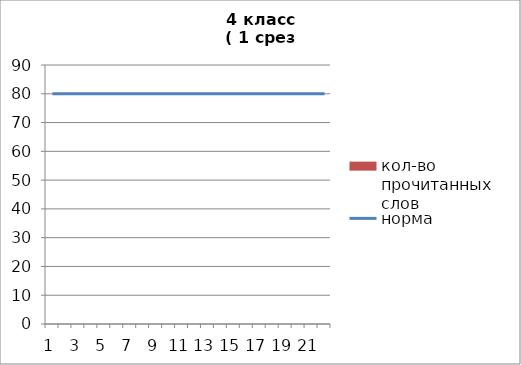
| Category | кол-во прочитанных слов |
|---|---|
| 0 | 0 |
| 1 | 0 |
| 2 | 0 |
| 3 | 0 |
| 4 | 0 |
| 5 | 0 |
| 6 | 0 |
| 7 | 0 |
| 8 | 0 |
| 9 | 0 |
| 10 | 0 |
| 11 | 0 |
| 12 | 0 |
| 13 | 0 |
| 14 | 0 |
| 15 | 0 |
| 16 | 0 |
| 17 | 0 |
| 18 | 0 |
| 19 | 0 |
| 20 | 0 |
| 21 | 0 |